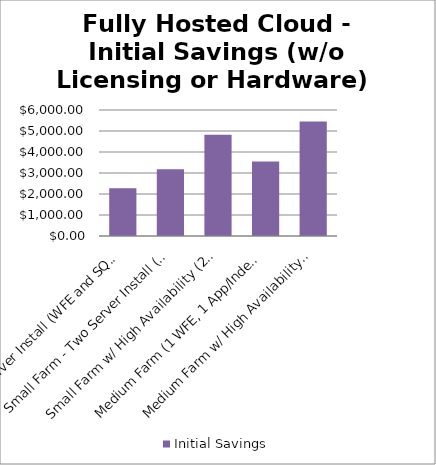
| Category | Initial Savings |
|---|---|
| Single Server Install (WFE and SQL on 1 VM) | 2276.269 |
| Small Farm - Two Server Install (WFE and SQL) | 3174.608 |
| Small Farm w/ High Availability (2 WFE - 2 SQL) | 4827.043 |
| Medium Farm (1 WFE, 1 App/Index, 1 SQL) | 3547.455 |
| Medium Farm w/ High Availability (2 WFE, 2 A/I, 2 SQL) | 5456.894 |